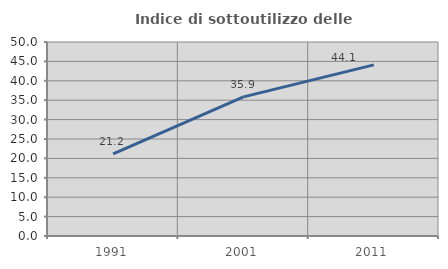
| Category | Indice di sottoutilizzo delle abitazioni  |
|---|---|
| 1991.0 | 21.17 |
| 2001.0 | 35.863 |
| 2011.0 | 44.112 |